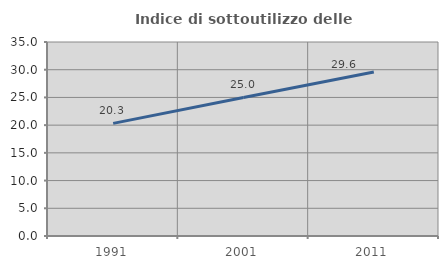
| Category | Indice di sottoutilizzo delle abitazioni  |
|---|---|
| 1991.0 | 20.316 |
| 2001.0 | 25 |
| 2011.0 | 29.588 |